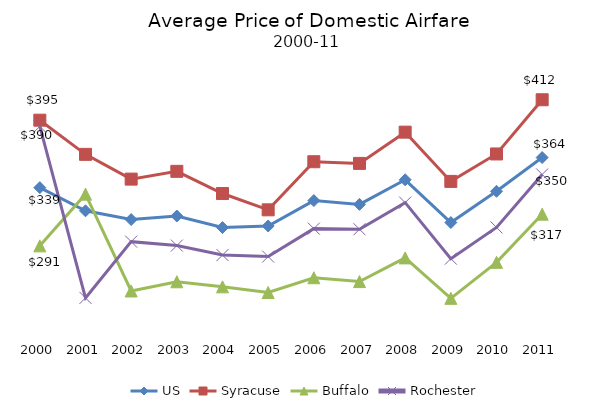
| Category | US | Syracuse | Buffalo | Rochester |
|---|---|---|---|---|
| 2000.0 | 339.033 | 395.03 | 290.69 | 389.95 |
| 2001.0 | 319.798 | 366.67 | 333.6 | 247.48 |
| 2002.0 | 312.525 | 346.11 | 253.23 | 294.19 |
| 2003.0 | 315.467 | 352.57 | 260.87 | 290.94 |
| 2004.0 | 305.875 | 334.14 | 256.65 | 283.07 |
| 2005.0 | 307.185 | 320.61 | 251.97 | 281.79 |
| 2006.0 | 328.3 | 360.55 | 264.21 | 305 |
| 2007.0 | 325.14 | 359.16 | 261.03 | 304.5 |
| 2008.0 | 345.553 | 385.11 | 280.7 | 326.59 |
| 2009.0 | 310.062 | 344.22 | 247.12 | 280.09 |
| 2010.0 | 336 | 367 | 277 | 306 |
| 2011.0 | 364 | 412 | 317 | 350 |